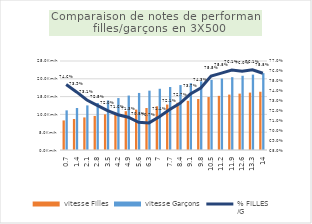
| Category | vitesse Filles | vitesse Garçons |
|---|---|---|
| 0.7 | 1900-01-08 07:23:04 | 1900-01-11 03:12:59 |
| 1.4 | 1900-01-08 17:01:56 | 1900-01-11 18:58:09 |
| 2.1 | 1900-01-09 03:39:39 | 1900-01-12 12:41:45 |
| 2.8 | 1900-01-09 13:47:14 | 1900-01-13 04:52:13 |
| 3.5 | 1900-01-10 00:26:42 | 1900-01-13 22:01:14 |
| 4.2 | 1900-01-10 10:40:37 | 1900-01-14 14:16:12 |
| 4.9 | 1900-01-10 21:49:05 | 1900-01-15 07:08:19 |
| 5.6 | 1900-01-11 08:16:08 | 1900-01-16 00:34:11 |
| 6.3 | 1900-01-11 18:58:09 | 1900-01-16 16:00:00 |
| 7.0 | 1900-01-12 06:32:43 | 1900-01-17 04:44:19 |
| 7.7 | 1900-01-12 18:22:58 | 1900-01-17 16:55:04 |
| 8.4 | 1900-01-13 06:25:39 | 1900-01-18 05:50:16 |
| 9.1 | 1900-01-13 19:27:28 | 1900-01-18 18:00:00 |
| 9.8 | 1900-01-14 07:45:59 | 1900-01-19 06:51:25 |
| 10.5 | 1900-01-14 21:01:29 | 1900-01-19 16:59:33 |
| 11.2 | 1900-01-15 05:04:13 | 1900-01-20 01:47:03 |
| 11.9 | 1900-01-15 13:29:13 | 1900-01-20 10:54:32 |
| 12.6 | 1900-01-15 20:03:31 | 1900-01-20 20:23:09 |
| 13.3 | 1900-01-16 02:51:56 | 1900-01-21 04:14:07 |
| 14.0 | 1900-01-16 08:43:38 | 1900-01-21 14:24:00 |